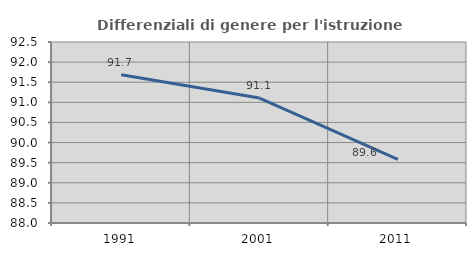
| Category | Differenziali di genere per l'istruzione superiore |
|---|---|
| 1991.0 | 91.687 |
| 2001.0 | 91.106 |
| 2011.0 | 89.581 |